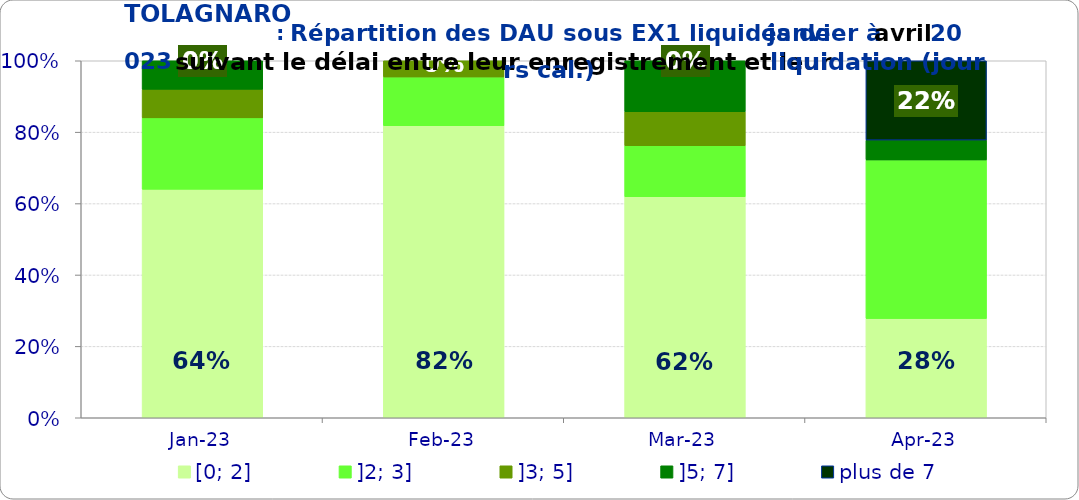
| Category | [0; 2] | ]2; 3] | ]3; 5] | ]5; 7] | plus de 7 |
|---|---|---|---|---|---|
| 2023-01-01 | 0.64 | 0.2 | 0.08 | 0.08 | 0 |
| 2023-02-01 | 0.818 | 0.136 | 0.045 | 0 | 0 |
| 2023-03-01 | 0.619 | 0.143 | 0.095 | 0.143 | 0 |
| 2023-04-01 | 0.278 | 0.444 | 0 | 0.056 | 0.222 |